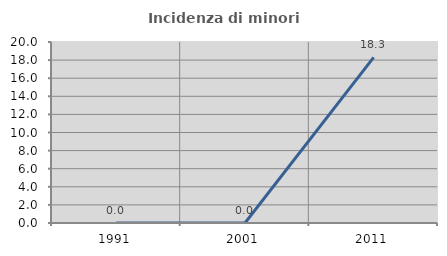
| Category | Incidenza di minori stranieri |
|---|---|
| 1991.0 | 0 |
| 2001.0 | 0 |
| 2011.0 | 18.31 |